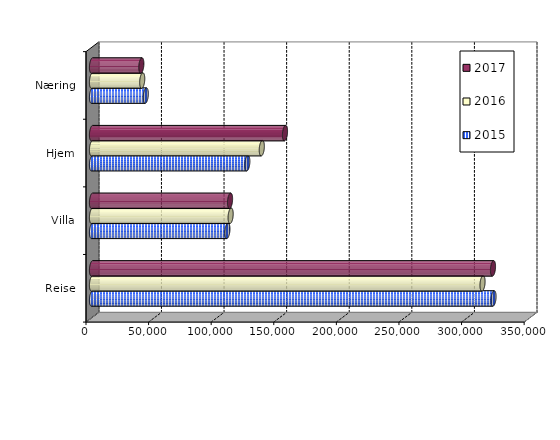
| Category | 2015 | 2016 | 2017 |
|---|---|---|---|
| Reise | 320739 | 311962 | 320312 |
| Villa | 108145.685 | 110745.204 | 110274.261 |
| Hjem | 124066.909 | 135636.54 | 154164.243 |
| Næring | 42956.936 | 40113.599 | 39410.456 |